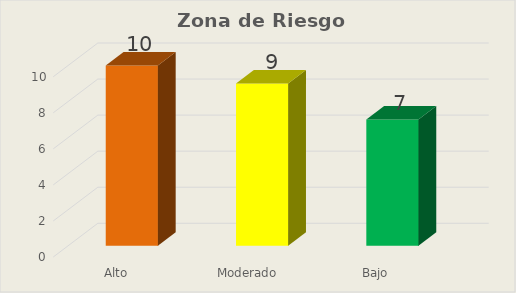
| Category | Series 0 |
|---|---|
| Alto | 10 |
| Moderado | 9 |
| Bajo  | 7 |